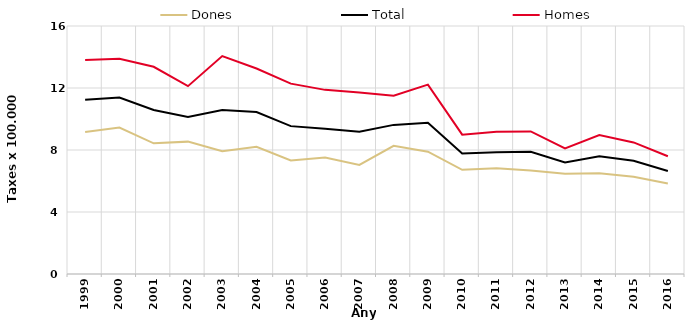
| Category | Dones | Total | Homes |
|---|---|---|---|
| 1999.0 | 9.16 | 11.24 | 13.8 |
| 2000.0 | 9.45 | 11.39 | 13.89 |
| 2001.0 | 8.43 | 10.58 | 13.37 |
| 2002.0 | 8.54 | 10.13 | 12.12 |
| 2003.0 | 7.92 | 10.58 | 14.06 |
| 2004.0 | 8.21 | 10.45 | 13.26 |
| 2005.0 | 7.33 | 9.54 | 12.28 |
| 2006.0 | 7.51 | 9.37 | 11.88 |
| 2007.0 | 7.04 | 9.18 | 11.71 |
| 2008.0 | 8.27 | 9.62 | 11.5 |
| 2009.0 | 7.89 | 9.75 | 12.22 |
| 2010.0 | 6.72 | 7.78 | 8.99 |
| 2011.0 | 6.83 | 7.86 | 9.17 |
| 2012.0 | 6.68 | 7.88 | 9.2 |
| 2013.0 | 6.47 | 7.2 | 8.1 |
| 2014.0 | 6.5 | 7.6 | 8.96 |
| 2015.0 | 6.27 | 7.3 | 8.49 |
| 2016.0 | 5.84 | 6.64 | 7.6 |